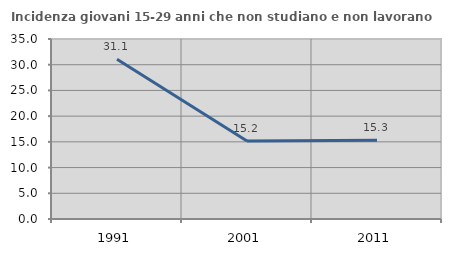
| Category | Incidenza giovani 15-29 anni che non studiano e non lavorano  |
|---|---|
| 1991.0 | 31.071 |
| 2001.0 | 15.186 |
| 2011.0 | 15.301 |